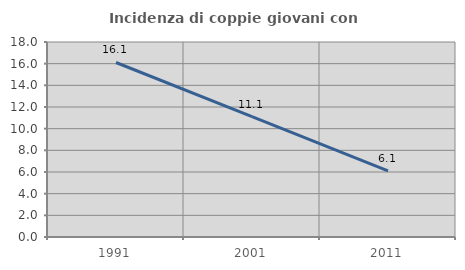
| Category | Incidenza di coppie giovani con figli |
|---|---|
| 1991.0 | 16.109 |
| 2001.0 | 11.116 |
| 2011.0 | 6.104 |